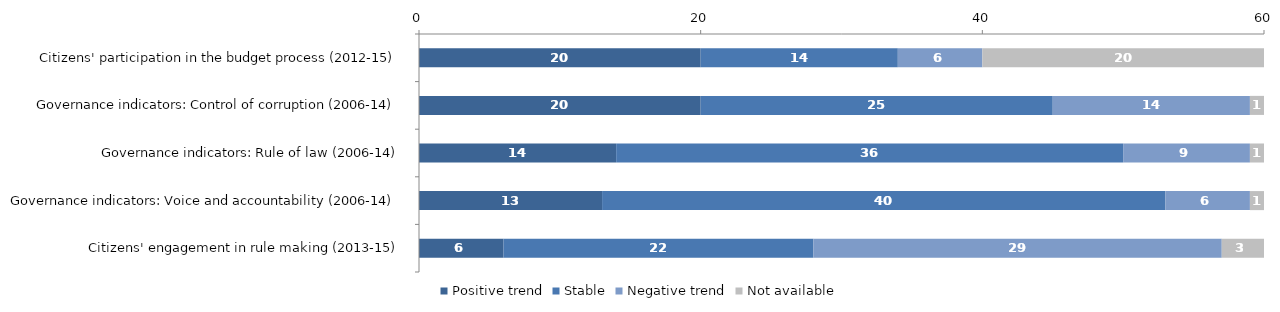
| Category | Positive trend | Stable | Negative trend | Not available |
|---|---|---|---|---|
| Citizens' participation in the budget process (2012-15) | 20 | 14 | 6 | 20 |
| Governance indicators: Control of corruption (2006-14) | 20 | 25 | 14 | 1 |
| Governance indicators: Rule of law (2006-14) | 14 | 36 | 9 | 1 |
| Governance indicators: Voice and accountability (2006-14) | 13 | 40 | 6 | 1 |
| Citizens' engagement in rule making (2013-15) | 6 | 22 | 29 | 3 |